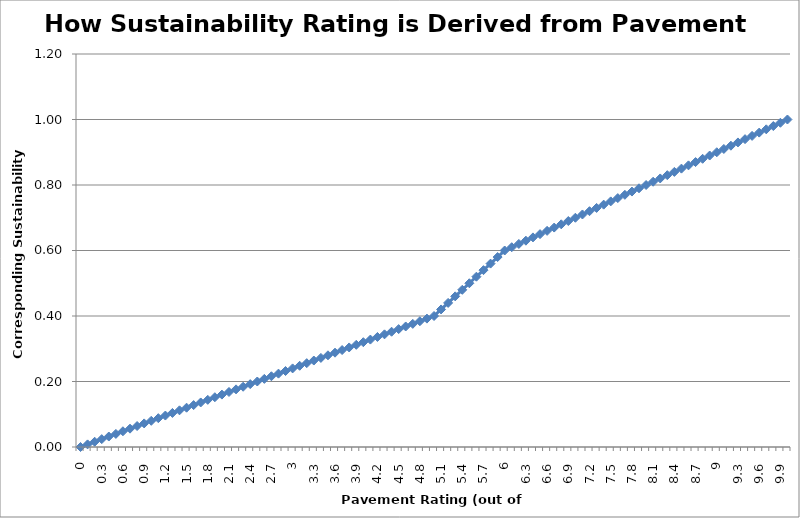
| Category | 1 |
|---|---|
| 0.0 | 0 |
| 0.1 | 0.008 |
| 0.2 | 0.016 |
| 0.3 | 0.024 |
| 0.4 | 0.032 |
| 0.5 | 0.04 |
| 0.6 | 0.048 |
| 0.7 | 0.056 |
| 0.8 | 0.064 |
| 0.9 | 0.072 |
| 1.0 | 0.08 |
| 1.1 | 0.088 |
| 1.2 | 0.096 |
| 1.3 | 0.104 |
| 1.4 | 0.112 |
| 1.5 | 0.12 |
| 1.6 | 0.128 |
| 1.7 | 0.136 |
| 1.8 | 0.144 |
| 1.9 | 0.152 |
| 2.0 | 0.16 |
| 2.1 | 0.168 |
| 2.2 | 0.176 |
| 2.3 | 0.184 |
| 2.4 | 0.192 |
| 2.5 | 0.2 |
| 2.6 | 0.208 |
| 2.7 | 0.216 |
| 2.8 | 0.224 |
| 2.9 | 0.232 |
| 3.0 | 0.24 |
| 3.1 | 0.248 |
| 3.2 | 0.256 |
| 3.3 | 0.264 |
| 3.4 | 0.272 |
| 3.5 | 0.28 |
| 3.6 | 0.288 |
| 3.7 | 0.296 |
| 3.8 | 0.304 |
| 3.9 | 0.312 |
| 4.0 | 0.32 |
| 4.1 | 0.328 |
| 4.2 | 0.336 |
| 4.3 | 0.344 |
| 4.4 | 0.352 |
| 4.5 | 0.36 |
| 4.6 | 0.368 |
| 4.7 | 0.376 |
| 4.8 | 0.384 |
| 4.9 | 0.392 |
| 5.0 | 0.4 |
| 5.1 | 0.42 |
| 5.2 | 0.44 |
| 5.3 | 0.46 |
| 5.4 | 0.48 |
| 5.5 | 0.5 |
| 5.6 | 0.52 |
| 5.7 | 0.54 |
| 5.8 | 0.56 |
| 5.9 | 0.58 |
| 6.0 | 0.6 |
| 6.1 | 0.61 |
| 6.2 | 0.62 |
| 6.3 | 0.63 |
| 6.4 | 0.64 |
| 6.5 | 0.65 |
| 6.6 | 0.66 |
| 6.7 | 0.67 |
| 6.8 | 0.68 |
| 6.9 | 0.69 |
| 7.0 | 0.7 |
| 7.1 | 0.71 |
| 7.2 | 0.72 |
| 7.3 | 0.73 |
| 7.4 | 0.74 |
| 7.5 | 0.75 |
| 7.6 | 0.76 |
| 7.7 | 0.77 |
| 7.8 | 0.78 |
| 7.9 | 0.79 |
| 8.0 | 0.8 |
| 8.1 | 0.81 |
| 8.2 | 0.82 |
| 8.3 | 0.83 |
| 8.4 | 0.84 |
| 8.5 | 0.85 |
| 8.6 | 0.86 |
| 8.7 | 0.87 |
| 8.8 | 0.88 |
| 8.9 | 0.89 |
| 9.0 | 0.9 |
| 9.1 | 0.91 |
| 9.2 | 0.92 |
| 9.3 | 0.93 |
| 9.4 | 0.94 |
| 9.5 | 0.95 |
| 9.6 | 0.96 |
| 9.7 | 0.97 |
| 9.8 | 0.98 |
| 9.9 | 0.99 |
| 10.0 | 1 |